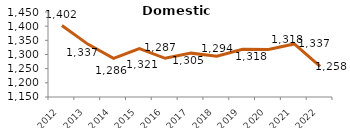
| Category | Domestico |
|---|---|
| 2012.0 | 1402.2 |
| 2013.0 | 1336.7 |
| 2014.0 | 1286.4 |
| 2015.0 | 1320.9 |
| 2016.0 | 1286.6 |
| 2017.0 | 1304.8 |
| 2018.0 | 1294.2 |
| 2019.0 | 1318.1 |
| 2020.0 | 1317.7 |
| 2021.0 | 1337.1 |
| 2022.0 | 1258.3 |